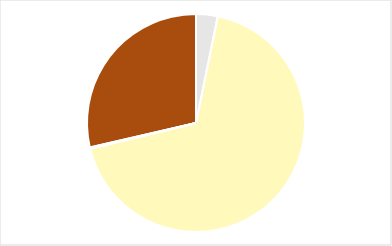
| Category | Series 0 |
|---|---|
| 0 | 0.032 |
| 1 | 0.68 |
| 2 | 0 |
| 3 | 0.002 |
| 4 | 0.286 |